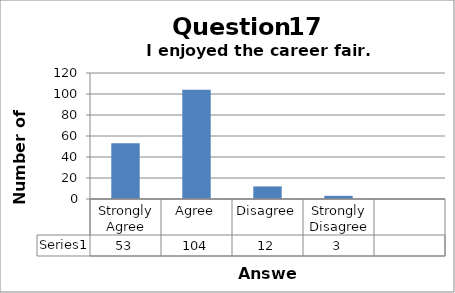
| Category | Series 0 |
|---|---|
| Strongly Agree | 53 |
| Agree | 104 |
| Disagree | 12 |
| Strongly Disagree | 3 |